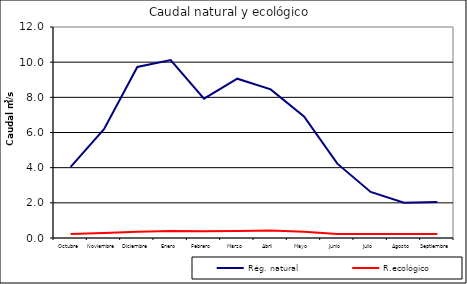
| Category | Rég. natural | R.ecológico |
|---|---|---|
| Octubre | 4.041 | 0.227 |
| Noviembre | 6.19 | 0.282 |
| Diciembre | 9.727 | 0.352 |
| Enero | 10.117 | 0.394 |
| Febrero | 7.923 | 0.383 |
| Marzo | 9.061 | 0.405 |
| Abril | 8.452 | 0.432 |
| Mayo | 6.91 | 0.353 |
| Junio | 4.228 | 0.227 |
| Julio | 2.618 | 0.227 |
| Agosto | 2.006 | 0.227 |
| Septiembre | 2.041 | 0.227 |